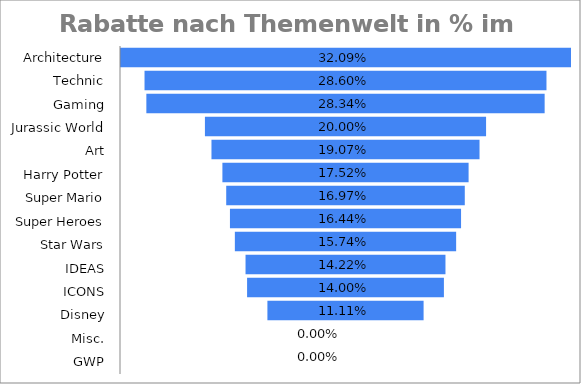
| Category | Minifiguren |
|---|---|
| GWP | 14 |
| ICONS | 101 |
| Art | 0 |
| Technic | 0 |
| IDEAS | 66 |
| Jurassic World | 4 |
| Super Heroes | 41 |
| Super Mario | 0 |
| Gaming | 1 |
| Harry Potter | 23 |
| Architecture | 0 |
| Star Wars | 52 |
| Misc. | 11 |
| Disney | 0 |